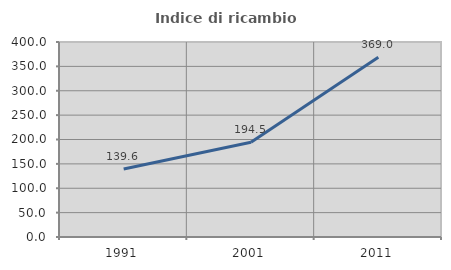
| Category | Indice di ricambio occupazionale  |
|---|---|
| 1991.0 | 139.642 |
| 2001.0 | 194.47 |
| 2011.0 | 368.966 |